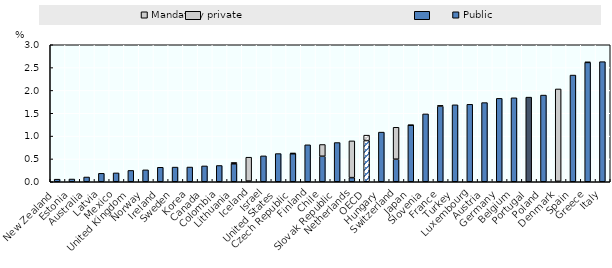
| Category | Public | Mandatory private |
|---|---|---|
| New Zealand | 0.057 | 0 |
| Estonia | 0.06 | 0 |
| Australia | 0.104 | 0 |
| Latvia | 0.185 | 0 |
| Mexico | 0.194 | 0 |
| United Kingdom | 0.248 | 0 |
| Norway | 0.26 | 0 |
| Ireland | 0.317 | 0 |
| Sweden | 0.321 | 0 |
| Korea | 0.322 | 0 |
| Canada | 0.347 | 0 |
| Colombia | 0.356 | 0 |
| Lithuania | 0.393 | 0.03 |
| Iceland | 0.015 | 0.523 |
| Israel | 0.567 | 0 |
| United States | 0.617 | 0 |
| Czech Republic | 0.613 | 0.017 |
| Finland | 0.809 | 0 |
| Chile | 0.559 | 0.257 |
| Slovak Republic | 0.859 | 0 |
| Netherlands | 0.09 | 0.805 |
| OECD | 0.902 | 0.118 |
| Hungary | 1.087 | 0 |
| Switzerland | 0.494 | 0.699 |
| Japan | 1.239 | 0 |
| Slovenia | 1.486 | 0 |
| France | 1.656 | 0.016 |
| Turkey | 1.685 | 0 |
| Luxembourg | 1.696 | 0 |
| Austria | 1.733 | 0 |
| Germany | 1.827 | 0 |
| Belgium | 1.838 | 0 |
| Portugal | 1.853 | 0 |
| Poland | 1.898 | 0 |
| Denmark | 0.009 | 2.023 |
| Spain | 2.336 | 0 |
| Greece | 2.613 | 0.008 |
| Italy | 2.63 | 0 |